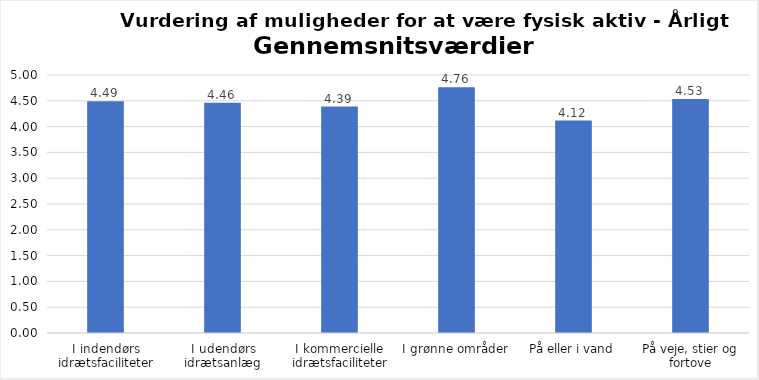
| Category | Gennemsnit |
|---|---|
| I indendørs idrætsfaciliteter | 4.49 |
| I udendørs idrætsanlæg | 4.463 |
| I kommercielle idrætsfaciliteter | 4.388 |
| I grønne områder | 4.761 |
| På eller i vand | 4.116 |
| På veje, stier og fortove | 4.533 |